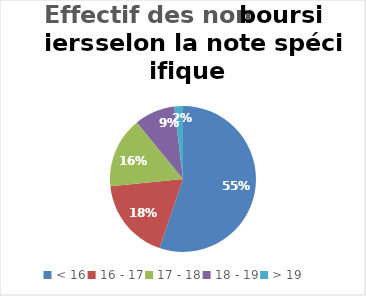
| Category | Effectif des non boursiers |
|---|---|
| < 16 | 31713 |
| 16 - 17 | 10449 |
| 17 - 18 | 9022 |
| 18 - 19 | 5155 |
| > 19  | 1099 |